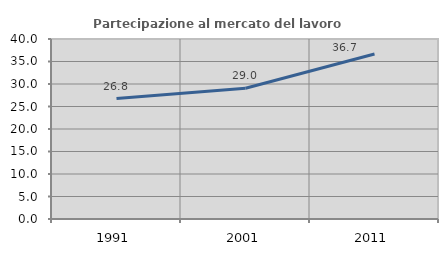
| Category | Partecipazione al mercato del lavoro  femminile |
|---|---|
| 1991.0 | 26.754 |
| 2001.0 | 29.042 |
| 2011.0 | 36.657 |